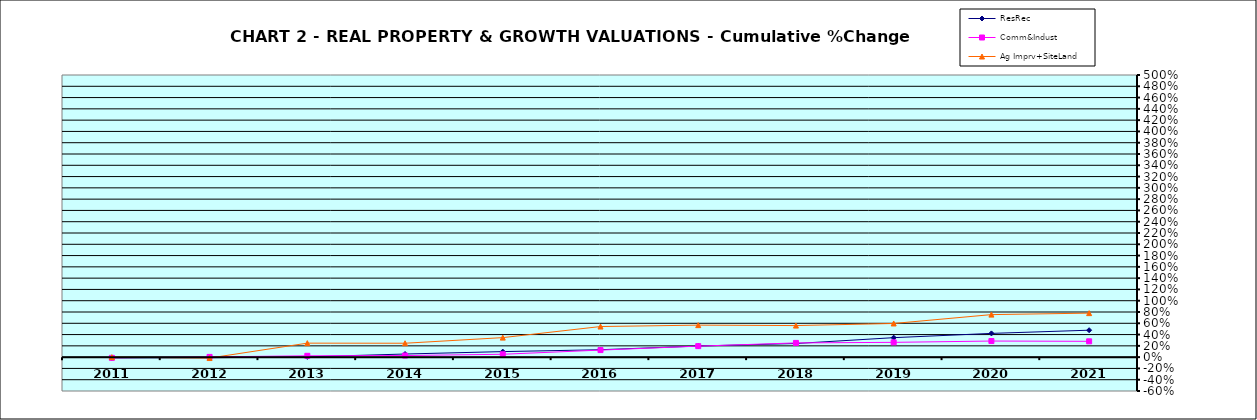
| Category | ResRec | Comm&Indust | Ag Imprv+SiteLand |
|---|---|---|---|
| 2011.0 | -0.013 | -0.012 | 0 |
| 2012.0 | -0.01 | 0.004 | -0.016 |
| 2013.0 | 0.005 | 0.024 | 0.248 |
| 2014.0 | 0.055 | 0.028 | 0.246 |
| 2015.0 | 0.098 | 0.051 | 0.346 |
| 2016.0 | 0.131 | 0.125 | 0.542 |
| 2017.0 | 0.197 | 0.195 | 0.567 |
| 2018.0 | 0.241 | 0.252 | 0.559 |
| 2019.0 | 0.345 | 0.262 | 0.597 |
| 2020.0 | 0.421 | 0.285 | 0.754 |
| 2021.0 | 0.478 | 0.28 | 0.78 |